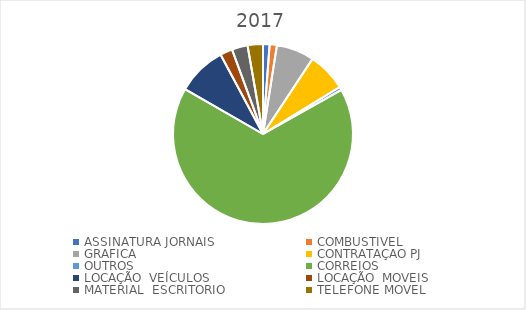
| Category | Series 0 |
|---|---|
| ASSINATURA JORNAIS | 1556 |
| COMBUSTIVEL | 1717.23 |
| GRAFICA | 8986.3 |
| CONTRATAÇAO PJ | 9237.56 |
| OUTROS | 800 |
| CORREIOS | 87838 |
| LOCAÇÃO  VEÍCULOS | 11766.55 |
| LOCAÇÃO  MOVEIS | 2940 |
| MATERIAL  ESCRITORIO | 3747.85 |
| TELEFONE MOVEL | 3646.12 |